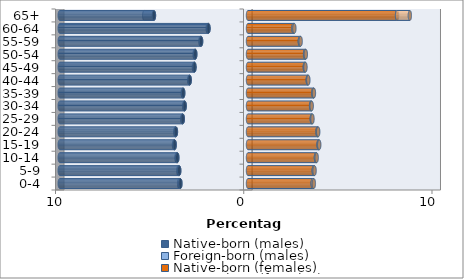
| Category | Native-born (males) | Foreign-born (males) | Native-born (females) | Foreign-born (females) |
|---|---|---|---|---|
| 0-4 | -3.592 | -0.066 | 3.438 | 0.06 |
| 5-9 | -3.655 | -0.045 | 3.494 | 0.042 |
| 10-14 | -3.756 | -0.042 | 3.609 | 0.039 |
| 15-19 | -3.896 | -0.034 | 3.751 | 0.033 |
| 20-24 | -3.829 | -0.034 | 3.694 | 0.035 |
| 25-29 | -3.464 | -0.031 | 3.39 | 0.035 |
| 30-34 | -3.364 | -0.025 | 3.352 | 0.032 |
| 35-39 | -3.442 | -0.023 | 3.472 | 0.03 |
| 40-44 | -3.097 | -0.024 | 3.176 | 0.03 |
| 45-49 | -2.844 | -0.028 | 3.019 | 0.034 |
| 50-54 | -2.801 | -0.033 | 3.032 | 0.039 |
| 55-59 | -2.492 | -0.036 | 2.755 | 0.042 |
| 60-64 | -2.099 | -0.04 | 2.413 | 0.05 |
| 65+ | -4.997 | -0.515 | 7.919 | 0.679 |